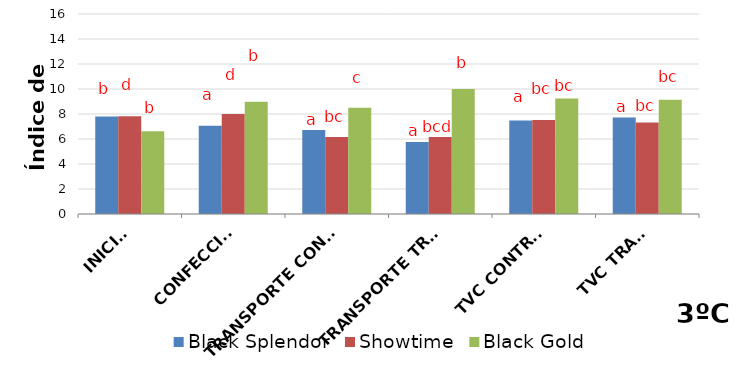
| Category | Black Splendor | Showtime | Black Gold |
|---|---|---|---|
| INICIAL | 7.805 | 7.814 | 6.623 |
| CONFECCIÓN | 7.067 | 8.006 | 8.971 |
| TRANSPORTE CONTROL | 6.728 | 6.167 | 8.504 |
| TRANSPORTE TRAT. | 5.761 | 6.151 | 9.999 |
| TVC CONTROL | 7.489 | 7.527 | 9.242 |
| TVC TRAT. | 7.725 | 7.313 | 9.149 |